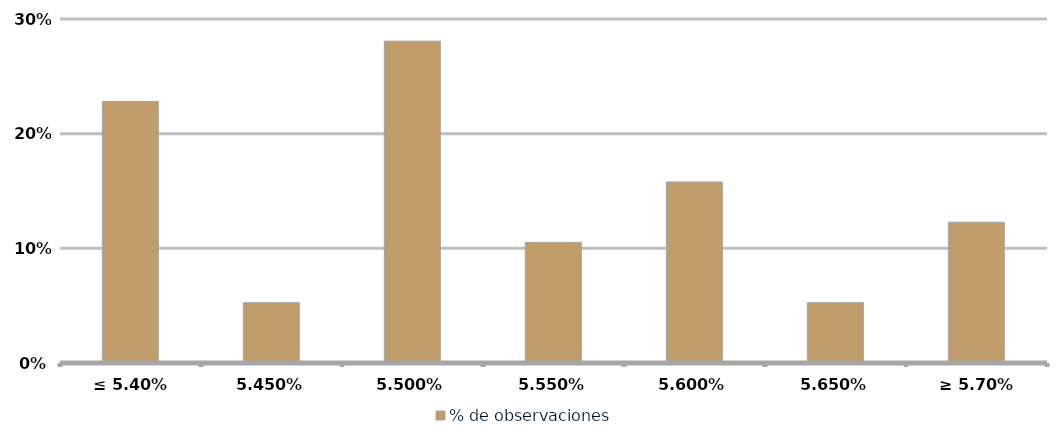
| Category | % de observaciones  |
|---|---|
| ≤ 5.40% | 0.228 |
| 5.45% | 0.053 |
| 5.50% | 0.281 |
| 5.55% | 0.105 |
| 5.60% | 0.158 |
| 5.65% | 0.053 |
| ≥ 5.70% | 0.123 |